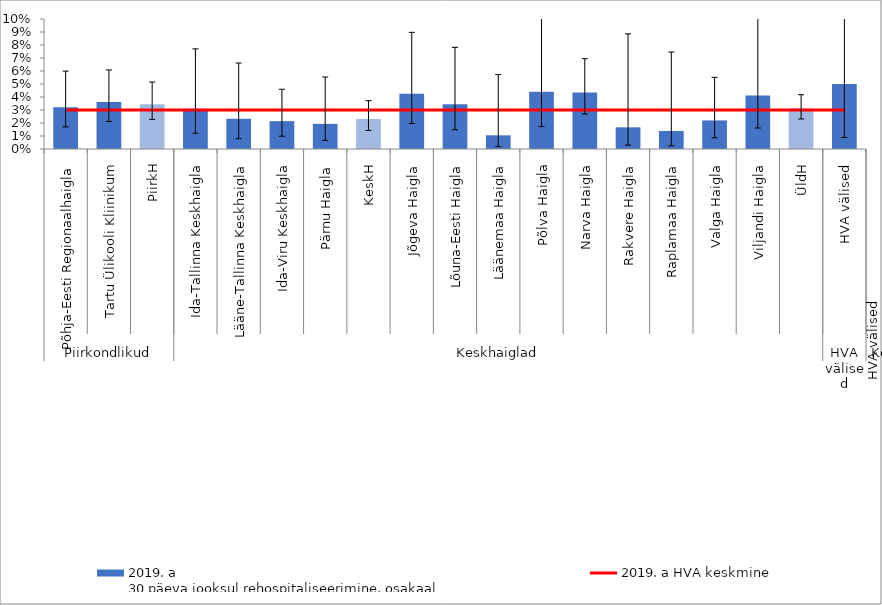
| Category | 2019. a
30 päeva jooksul rehospitaliseerimine, osakaal |
|---|---|
| 0 | 0.032 |
| 1 | 0.036 |
| 2 | 0.034 |
| 3 | 0.031 |
| 4 | 0.023 |
| 5 | 0.021 |
| 6 | 0.019 |
| 7 | 0.023 |
| 8 | 0.043 |
| 9 | 0.034 |
| 10 | 0.011 |
| 11 | 0.044 |
| 12 | 0.043 |
| 13 | 0.017 |
| 14 | 0.014 |
| 15 | 0.022 |
| 16 | 0.041 |
| 17 | 0.031 |
| 18 | 0.05 |